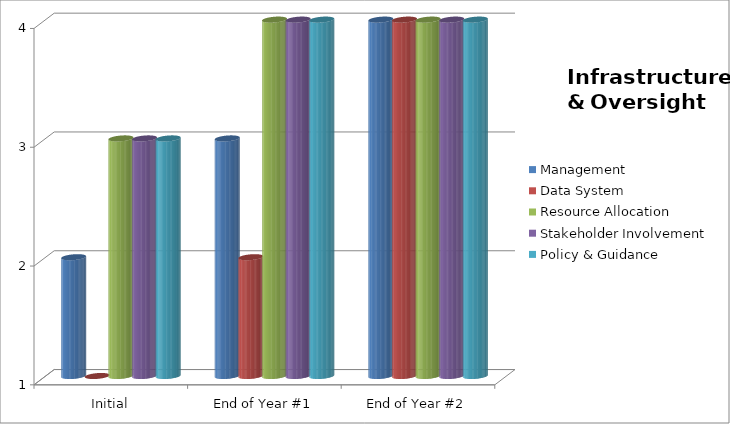
| Category | Management  | Data System  | Resource Allocation  | Stakeholder Involvement  | Policy & Guidance  |
|---|---|---|---|---|---|
| Initial | 2 | 1 | 3 | 3 | 3 |
| End of Year #1 | 3 | 2 | 4 | 4 | 4 |
| End of Year #2 | 4 | 4 | 4 | 4 | 4 |